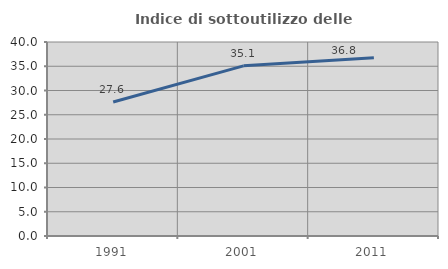
| Category | Indice di sottoutilizzo delle abitazioni  |
|---|---|
| 1991.0 | 27.619 |
| 2001.0 | 35.088 |
| 2011.0 | 36.765 |